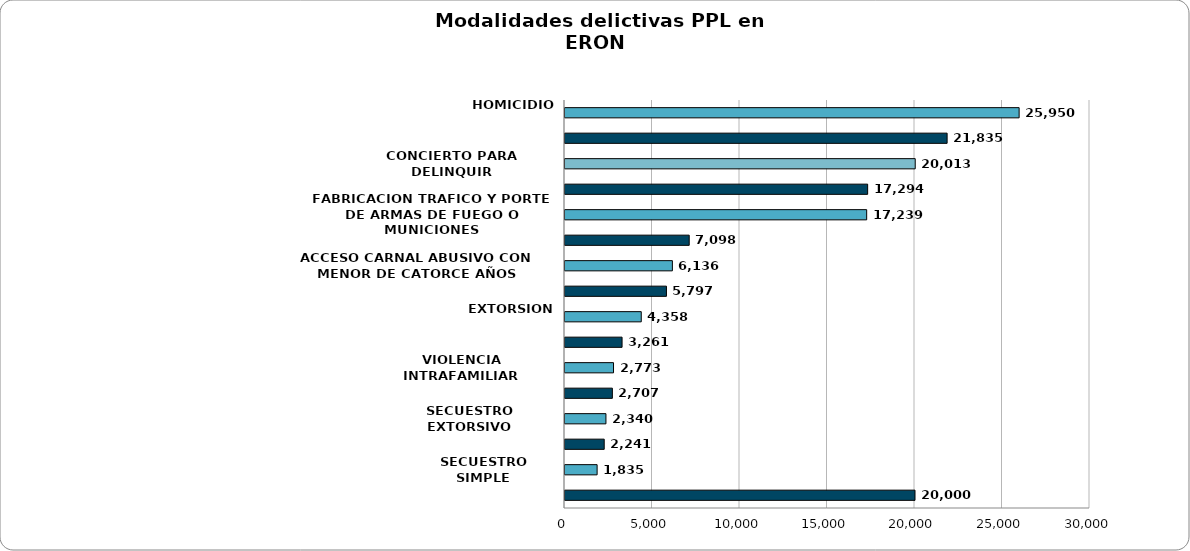
| Category | HOMICIDIO HURTO CONCIERTO PARA DELINQUIR TRAFICO FABRICACION O PORTE DE ESTUPEFACIENTES FABRICACION TRAFICO Y PORTE DE ARMAS DE FUEGO O MUNICIONES ACTOS SEXUALES CON MENOR DE CATORCE AÑOS ACCESO CARNAL ABUSIVO CON MENOR DE CATORCE AÑOS FABRICACIÓN, TRÁFIC |
|---|---|
| HOMICIDIO | 25950 |
| HURTO | 21835 |
| CONCIERTO PARA DELINQUIR | 20013 |
| TRAFICO FABRICACION O PORTE DE ESTUPEFACIENTES | 17294 |
| FABRICACION TRAFICO Y PORTE DE ARMAS DE FUEGO O MUNICIONES | 17239 |
| ACTOS SEXUALES CON MENOR DE CATORCE AÑOS | 7098 |
| ACCESO CARNAL ABUSIVO CON MENOR DE CATORCE AÑOS | 6136 |
| FABRICACIÓN, TRÁFICO, PORTE O TENENCIA DE ARMAS DE FUEGO, ACCESORIOS, PARTES O MUNICIONES | 5797 |
| EXTORSION | 4358 |
| ACCESO CARNAL VIOLENTO | 3261 |
| VIOLENCIA INTRAFAMILIAR | 2773 |
| FABRICACION  TRAFICO Y PORTE DE ARMAS Y MUNICIONES DE USO PRIVATIVO DE LAS FUERZAS ARMADAS | 2707 |
| SECUESTRO EXTORSIVO | 2340 |
| USO DE MENORES DE EDAD PARA LA COMISION DE DELITOS | 2241 |
| SECUESTRO SIMPLE | 1835 |
| Otros Delitos | 20000 |